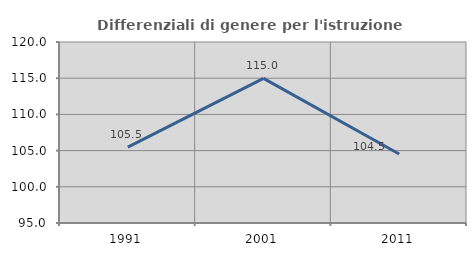
| Category | Differenziali di genere per l'istruzione superiore |
|---|---|
| 1991.0 | 105.471 |
| 2001.0 | 114.978 |
| 2011.0 | 104.534 |